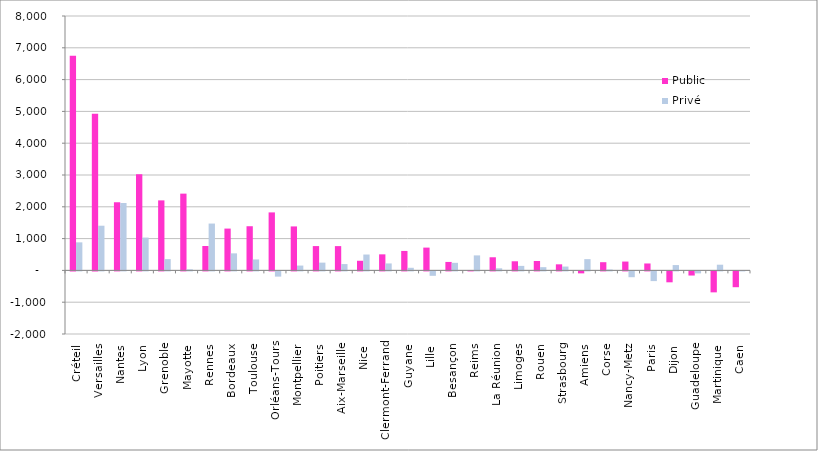
| Category | Public | Privé |
|---|---|---|
| Créteil | 6753 | 882 |
| Versailles | 4929 | 1405 |
| Nantes | 2143 | 2120 |
| Lyon | 3024 | 1032 |
| Grenoble | 2202 | 355 |
| Mayotte | 2414 | 35 |
| Rennes | 767 | 1473 |
| Bordeaux | 1315 | 536 |
| Toulouse | 1389 | 344 |
| Orléans-Tours | 1824 | -164 |
| Montpellier | 1383 | 152 |
| Poitiers | 765 | 244 |
| Aix-Marseille | 764 | 199 |
| Nice | 303 | 499 |
| Clermont-Ferrand | 505 | 219 |
| Guyane | 612 | 82 |
| Lille | 717 | -139 |
| Besançon | 266 | 238 |
| Reims | 12 | 472 |
| La Réunion | 413 | 66 |
| Limoges | 287 | 142 |
| Rouen | 295 | 102 |
| Strasbourg | 191 | 121 |
| Amiens | -62 | 354 |
| Corse | 258 | 28 |
| Nancy-Metz | 278 | -183 |
| Paris | 218 | -305 |
| Dijon | -343 | 168 |
| Guadeloupe | -130 | -62 |
| Martinique | -659 | 179 |
| Caen | -497 | 6 |